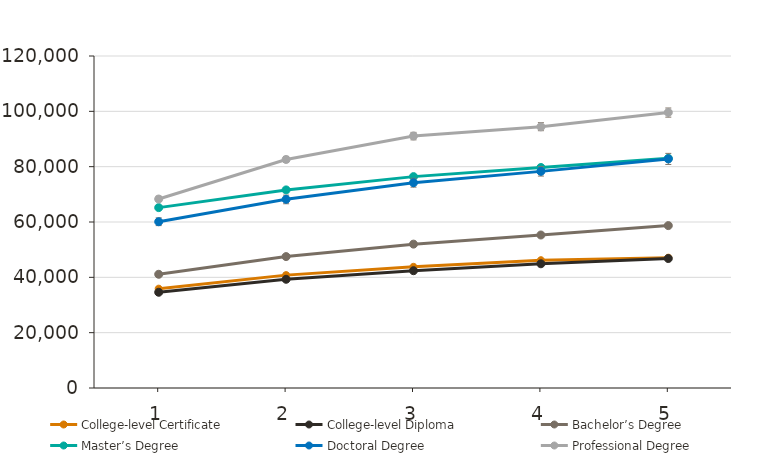
| Category | College-level Certificate | College-level Diploma | Bachelor’s Degree | Master’s Degree | Doctoral Degree | Professional Degree |
|---|---|---|---|---|---|---|
| 1.0 | 35900 | 34600 | 41100 | 65200 | 60100 | 68300 |
| 2.0 | 40800 | 39300 | 47500 | 71600 | 68200 | 82600 |
| 3.0 | 43800 | 42400 | 52000 | 76400 | 74200 | 91100 |
| 4.0 | 46200 | 44900 | 55300 | 79700 | 78300 | 94400 |
| 5.0 | 47100 | 46800 | 58700 | 83000 | 82800 | 99600 |